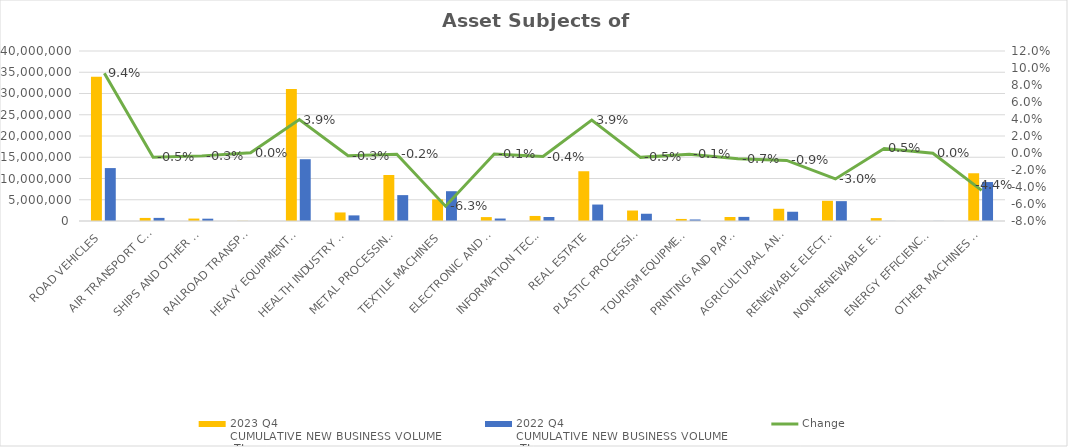
| Category | 2023 Q4 
CUMULATIVE NEW BUSINESS VOLUME
 TL | 2022 Q4 
CUMULATIVE NEW BUSINESS VOLUME
 TL |
|---|---|---|
| ROAD VEHICLES | 33948751.854 | 12451848.55 |
| AIR TRANSPORT CONVEYANCE | 721899.879 | 732638 |
| SHIPS AND OTHER SEA-GOING VESSELS | 572964.919 | 543889.318 |
| RAILROAD TRANSPORT VEHICLES | 33801.25 | 6281 |
| HEAVY EQUIPMENT AND CONSTRUCTION MACHINERY | 31078091.458 | 14533810.366 |
| HEALTH INDUSTRY AND AESTHETIC INSTRUMENTS | 2011237.773 | 1319613.476 |
| METAL PROCESSING MACHINE | 10828026.775 | 6089279.436 |
| TEXTILE MACHINES | 5083389.075 | 7010397.747 |
| ELECTRONIC AND OPTICAL DEVICES | 919695.318 | 580877.305 |
| INFORMATION TECHNOLOGIES AND OFFICE SYSTEMS | 1188011.401 | 935715.717 |
| REAL ESTATE | 11706884.561 | 3871159.281 |
| PLASTIC PROCESSING MACHINES | 2465160.834 | 1707234.762 |
| TOURISM EQUIPMENT | 486108.867 | 358406.217 |
| PRINTING AND PAPER PROCESSING MACHINES | 948268.389 | 968743.128 |
| AGRICULTURAL AND LIVESTOCK FARMING MACHINES | 2876905.56 | 2179738.339 |
| RENEWABLE ELECTRICITY GENERATION | 4749946.362 | 4672660.392 |
| NON-RENEWABLE ELECTRIC ENERGY GENERATION | 683764 | 16340.788 |
| ENERGY EFFICIENCY EQUIPMENT | 0 | 20581.342 |
| OTHER MACHINES AND EQUIPMENT | 11233823.995 | 9165681.821 |